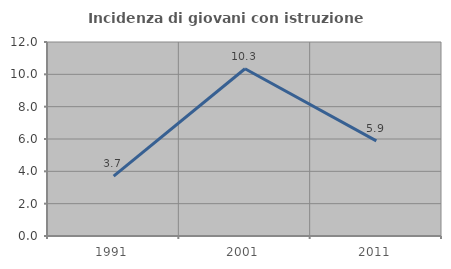
| Category | Incidenza di giovani con istruzione universitaria |
|---|---|
| 1991.0 | 3.704 |
| 2001.0 | 10.345 |
| 2011.0 | 5.882 |